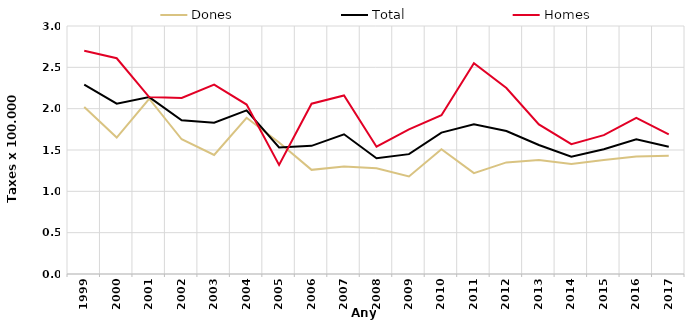
| Category | Dones | Total | Homes |
|---|---|---|---|
| 1999.0 | 2.02 | 2.29 | 2.7 |
| 2000.0 | 1.65 | 2.06 | 2.61 |
| 2001.0 | 2.12 | 2.14 | 2.14 |
| 2002.0 | 1.63 | 1.86 | 2.13 |
| 2003.0 | 1.44 | 1.83 | 2.29 |
| 2004.0 | 1.89 | 1.98 | 2.05 |
| 2005.0 | 1.59 | 1.53 | 1.32 |
| 2006.0 | 1.26 | 1.55 | 2.06 |
| 2007.0 | 1.3 | 1.69 | 2.16 |
| 2008.0 | 1.28 | 1.4 | 1.54 |
| 2009.0 | 1.18 | 1.45 | 1.75 |
| 2010.0 | 1.51 | 1.71 | 1.92 |
| 2011.0 | 1.22 | 1.81 | 2.55 |
| 2012.0 | 1.35 | 1.73 | 2.25 |
| 2013.0 | 1.38 | 1.56 | 1.81 |
| 2014.0 | 1.33 | 1.42 | 1.57 |
| 2015.0 | 1.38 | 1.51 | 1.68 |
| 2016.0 | 1.42 | 1.63 | 1.89 |
| 2017.0 | 1.43 | 1.54 | 1.69 |